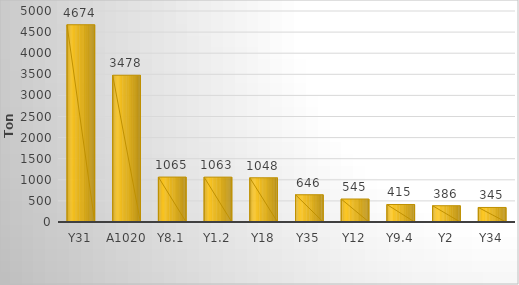
| Category | Series 1 |
|---|---|
| Y31 | 4674.211 |
| A1020 | 3477.628 |
| Y8.1 | 1064.685 |
| Y1.2 | 1063.314 |
| Y18 | 1047.765 |
| Y35 | 645.894 |
| Y12 | 544.997 |
| Y9.4 | 414.803 |
| Y2 | 385.724 |
| Y34 | 344.617 |